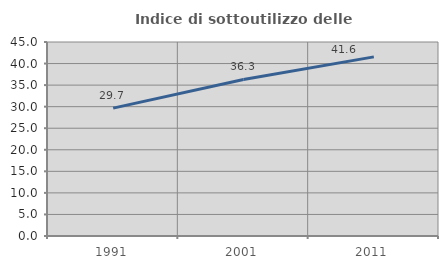
| Category | Indice di sottoutilizzo delle abitazioni  |
|---|---|
| 1991.0 | 29.657 |
| 2001.0 | 36.312 |
| 2011.0 | 41.553 |